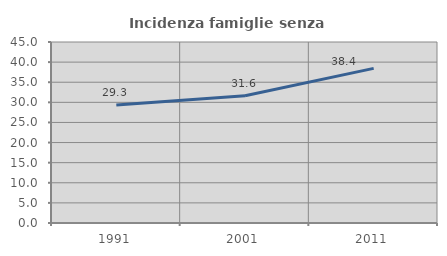
| Category | Incidenza famiglie senza nuclei |
|---|---|
| 1991.0 | 29.335 |
| 2001.0 | 31.644 |
| 2011.0 | 38.449 |